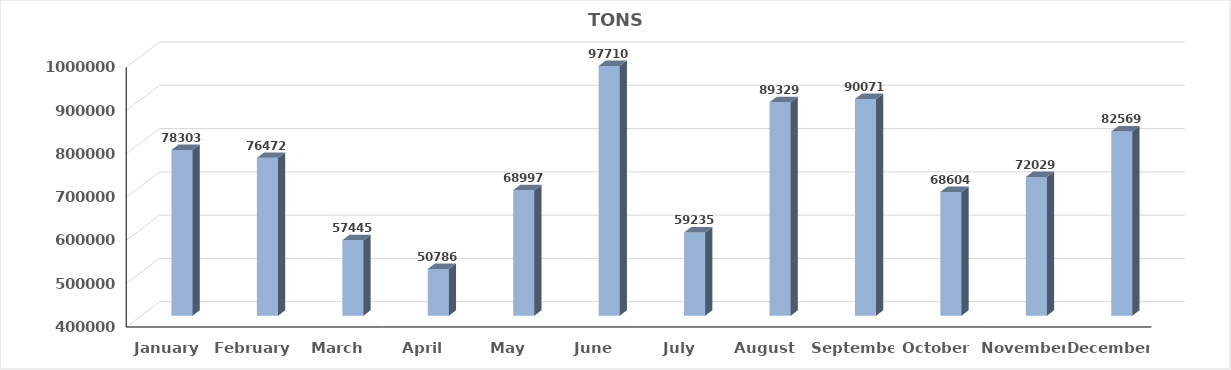
| Category | TONS |
|---|---|
| January | 783032 |
| February | 764726 |
| March | 574457 |
| April | 507865 |
| May | 689973 |
| June | 977105 |
| July | 592353 |
| August | 893298 |
| September | 900716 |
| October | 686048 |
| November | 720297 |
| December | 825690 |